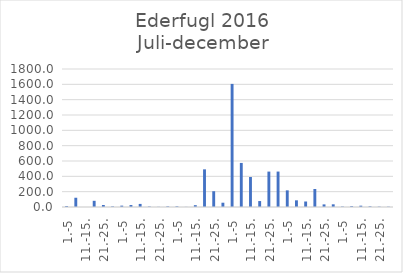
| Category | Series 0 |
|---|---|
| 1.-5 | 12.481 |
| 6.-10. | 120.699 |
| 11.-15. | 0 |
| 16.-20. | 80.848 |
| 21.-25. | 25.792 |
| 26.-31. | 7.791 |
| 1.-5 | 17.816 |
| 6.-10. | 25.626 |
| 11.-15. | 40.254 |
| 16.-20. | 6.15 |
| 21.-25. | 2.225 |
| 26.-31. | 8.098 |
| 1.-5 | 8.863 |
| 6.-10. | 1.638 |
| 11.-15. | 23.824 |
| 16.-20. | 491.204 |
| 21.-25. | 205.759 |
| 26.-30. | 55.911 |
| 1.-5 | 1605.652 |
| 6.-10. | 574.775 |
| 11.-15. | 391.632 |
| 16.-20. | 77.622 |
| 21.-25. | 461.881 |
| 26.-31. | 462.204 |
| 1.-5 | 217.259 |
| 6.-10. | 87.107 |
| 11.-15. | 71.673 |
| 16.-20. | 235.148 |
| 21.-25. | 34.024 |
| 26.-30. | 34.939 |
| 1.-5 | 5.928 |
| 6.-10. | 11.167 |
| 11.-15. | 17.212 |
| 16.-20. | 8.773 |
| 21.-25. | 4.683 |
| 26.-31. | 4.13 |